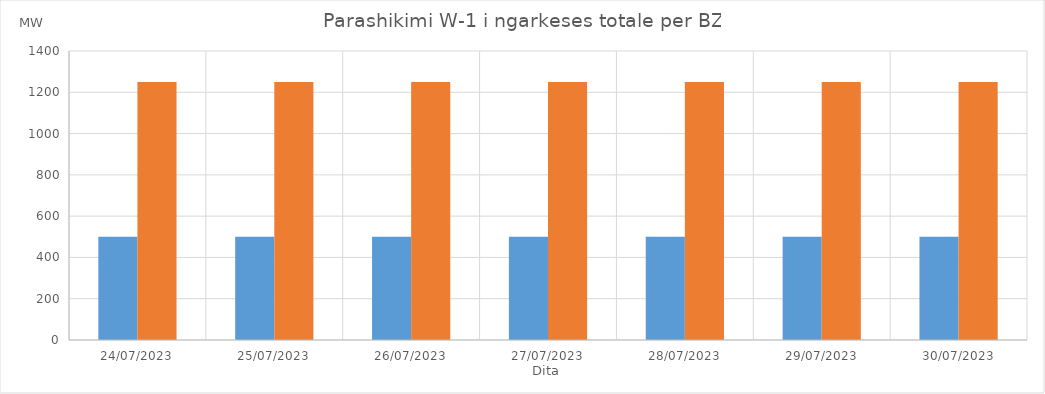
| Category | Min (MW) | Max (MW) |
|---|---|---|
| 24/07/2023 | 500 | 1250 |
| 25/07/2023 | 500 | 1250 |
| 26/07/2023 | 500 | 1250 |
| 27/07/2023 | 500 | 1250 |
| 28/07/2023 | 500 | 1250 |
| 29/07/2023 | 500 | 1250 |
| 30/07/2023 | 500 | 1250 |